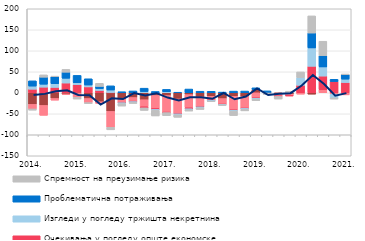
| Category | Трошкови извора за кредите | Конкуренција осталих банака | Очекивања у погледу опште економске ситуације | Изгледи у погледу тржишта некретнина | Проблематична потраживања | Спремност на преузимање ризика |
|---|---|---|---|---|---|---|
| 2014. | -27.614 | -10.883 | 8.513 | 7.366 | 12.572 | -2.931 |
|  | -30.154 | -23.565 | 13.381 | 6.958 | 16.79 | 5.591 |
|  | -13.58 | -4.04 | 12.84 | 8.698 | 16.68 | 1.322 |
|  | -3.194 | -0.943 | 23.215 | 11.346 | 14.413 | 6.815 |
| 2015. | 1.584 | -10.634 | 17.798 | 4.391 | 17.665 | -4.309 |
|  | -13.709 | -9.748 | 14.011 | 4.433 | 14.906 | -2.291 |
|  | -21.32 | -4.036 | 5.521 | 4.364 | 5.262 | 7.435 |
|  | -44.371 | -37.787 | 0.672 | 5.886 | 9.984 | -6.068 |
| 2016. | -13.683 | -9.865 | -0.183 | -2.017 | 2.537 | -5.896 |
|  | -11.339 | -9.602 | -0.197 | -1.974 | 4.34 | -2.332 |
|  | -16.54 | -16.708 | -2.652 | 2.885 | 8.061 | -6.073 |
|  | -6.439 | -30.804 | -2.596 | -1.957 | 3.101 | -13.396 |
| 2017. | -6.563 | -40.484 | -0.096 | 2.394 | 5.669 | -7.434 |
|  | -14.708 | -34.121 | -1.211 | -2.234 | 1.309 | -6.144 |
|  | -4.365 | -31.359 | -2.483 | -2.033 | 8.902 | -3.307 |
|  | -9.63 | -23.589 | -0.294 | -2.083 | 3.686 | -4.267 |
| 2018. | -8.401 | -9.465 | -0.308 | -2.087 | 3.545 | -0.758 |
|  | -13.817 | -13.719 | -0.384 | -1.143 | 1.627 | -1.188 |
|  | -8.391 | -32.723 | -0.405 | -2.001 | 3.96 | -10.656 |
|  | -8.386 | -28.581 | -0.415 | -2.043 | 4.097 | -3.682 |
| 2019. | 7.614 | -12.529 | -0.41 | -2.062 | 4.174 | -3.764 |
|  | -0.003 | 0 | -0.494 | 0 | 4.55 | -3.594 |
|  | -3.529 | -4.583 | -0.546 | 0 | 0 | -6.275 |
|  | -3.387 | -3.387 | -0.556 | 0 | 0 | 3.746 |
| 2020. | 0 | -3.3 | 17.776 | 18.324 | 0 | 13.5 |
|  | -3.3 | 0 | 63.053 | 43.711 | 35.524 | 40.8 |
|  | 0 | 7.2 | 32.599 | 21.695 | 27.071 | 34.2 |
|  | -0.778 | -3.063 | 26.746 | -8.12 | 5.298 | -3.047 |
| 2021. | 0 | -5.032 | 24.468 | 7.975 | 11.008 | 0.658 |